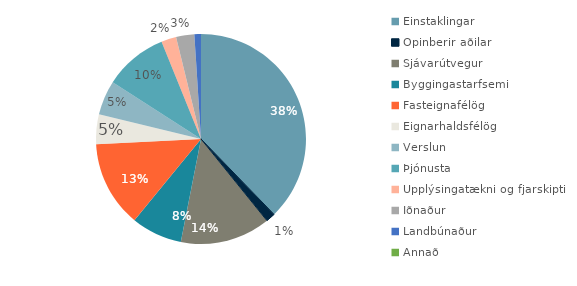
| Category | Series 0 |
|---|---|
| Einstaklingar | 329323 |
| Opinberir aðilar | 12542 |
| Sjávarútvegur | 121233 |
| Byggingastarfsemi | 68387 |
| Fasteignafélög | 115958 |
| Eignarhaldsfélög | 39700 |
| Verslun | 46533 |
| Þjónusta | 85237 |
| Upplýsingatækni og fjarskipti | 20130 |
| Iðnaður | 24493 |
| Landbúnaður | 8813 |
| Annað | 1 |